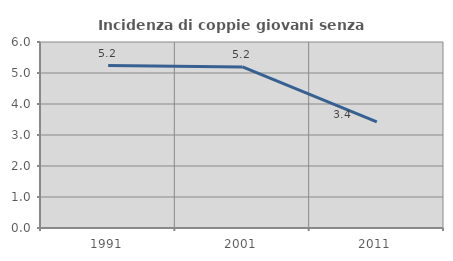
| Category | Incidenza di coppie giovani senza figli |
|---|---|
| 1991.0 | 5.241 |
| 2001.0 | 5.197 |
| 2011.0 | 3.425 |